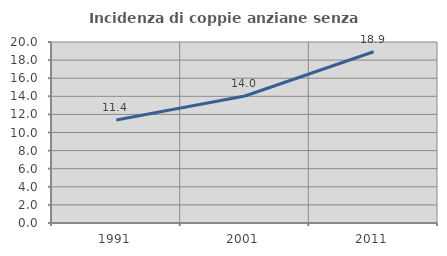
| Category | Incidenza di coppie anziane senza figli  |
|---|---|
| 1991.0 | 11.384 |
| 2001.0 | 14.032 |
| 2011.0 | 18.924 |